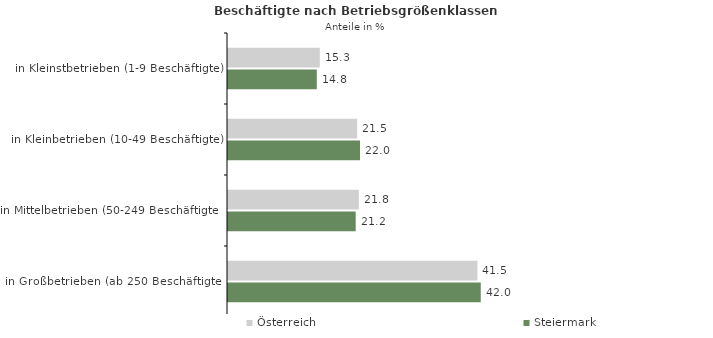
| Category | Österreich | Steiermark |
|---|---|---|
| in Kleinstbetrieben (1-9 Beschäftigte) | 15.273 | 14.768 |
| in Kleinbetrieben (10-49 Beschäftigte) | 21.487 | 21.955 |
| in Mittelbetrieben (50-249 Beschäftigte) | 21.75 | 21.237 |
| in Großbetrieben (ab 250 Beschäftigte) | 41.489 | 42.04 |